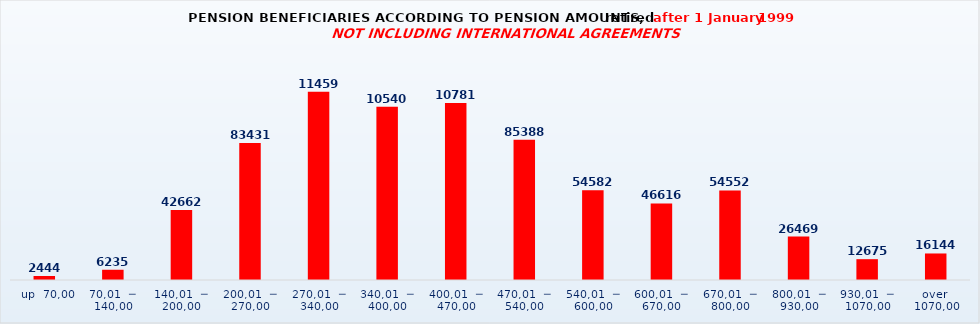
| Category | Series 0 |
|---|---|
|   up  70,00 | 2444 |
| 70,01  ─  140,00 | 6235 |
| 140,01  ─  200,00 | 42662 |
| 200,01  ─  270,00 | 83431 |
| 270,01  ─  340,00 | 114591 |
| 340,01  ─  400,00 | 105409 |
| 400,01  ─  470,00 | 107810 |
| 470,01  ─  540,00 | 85388 |
| 540,01  ─  600,00 | 54582 |
| 600,01  ─  670,00 | 46616 |
| 670,01  ─  800,00 | 54552 |
| 800,01  ─  930,00 | 26469 |
| 930,01  ─  1070,00 | 12675 |
| over  1070,00 | 16144 |